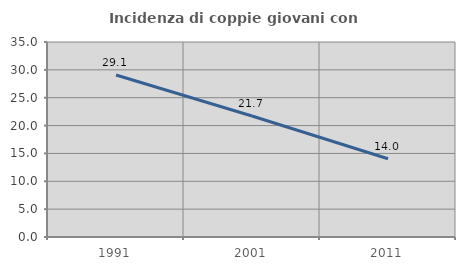
| Category | Incidenza di coppie giovani con figli |
|---|---|
| 1991.0 | 29.077 |
| 2001.0 | 21.717 |
| 2011.0 | 14.049 |